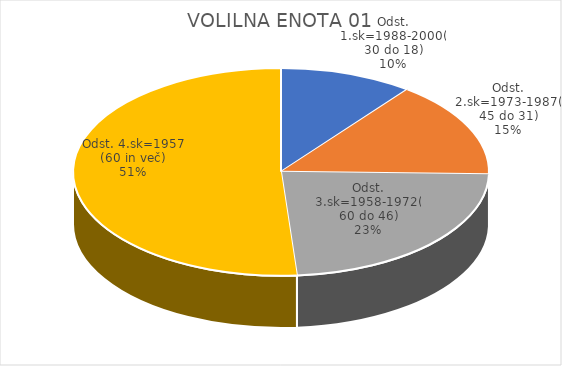
| Category | VOLILNA ENOTA 01 |
|---|---|
| Odst. 1.sk=1988-2000(30 do 18) | 1.62 |
| Odst. 2.sk=1973-1987(45 do 31) | 2.33 |
| Odst. 3.sk=1958-1972(60 do 46) | 3.65 |
| Odst. 4.sk=1957 (60 in več) | 7.98 |